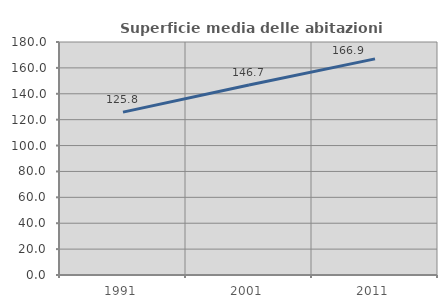
| Category | Superficie media delle abitazioni occupate |
|---|---|
| 1991.0 | 125.82 |
| 2001.0 | 146.732 |
| 2011.0 | 166.941 |